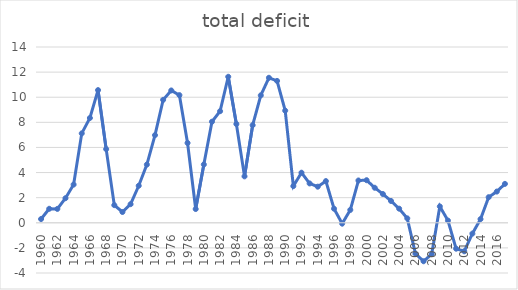
| Category | total deficit |
|---|---|
| 1960.0 | 0.298 |
| 1961.0 | 1.114 |
| 1962.0 | 1.105 |
| 1963.0 | 1.957 |
| 1964.0 | 3.044 |
| 1965.0 | 7.12 |
| 1966.0 | 8.345 |
| 1967.0 | 10.566 |
| 1968.0 | 5.867 |
| 1969.0 | 1.404 |
| 1970.0 | 0.858 |
| 1971.0 | 1.481 |
| 1972.0 | 2.948 |
| 1973.0 | 4.634 |
| 1974.0 | 6.981 |
| 1975.0 | 9.791 |
| 1976.0 | 10.538 |
| 1977.0 | 10.167 |
| 1978.0 | 6.357 |
| 1979.0 | 1.095 |
| 1980.0 | 4.641 |
| 1981.0 | 8.05 |
| 1982.0 | 8.889 |
| 1983.0 | 11.629 |
| 1984.0 | 7.867 |
| 1985.0 | 3.696 |
| 1986.0 | 7.776 |
| 1987.0 | 10.149 |
| 1988.0 | 11.549 |
| 1989.0 | 11.299 |
| 1990.0 | 8.929 |
| 1991.0 | 2.921 |
| 1992.0 | 3.989 |
| 1993.0 | 3.134 |
| 1994.0 | 2.875 |
| 1995.0 | 3.319 |
| 1996.0 | 1.121 |
| 1997.0 | -0.067 |
| 1998.0 | 1.025 |
| 1999.0 | 3.368 |
| 2000.0 | 3.39 |
| 2001.0 | 2.79 |
| 2002.0 | 2.292 |
| 2003.0 | 1.738 |
| 2004.0 | 1.123 |
| 2005.0 | 0.352 |
| 2006.0 | -2.454 |
| 2007.0 | -3.065 |
| 2008.0 | -2.501 |
| 2009.0 | 1.302 |
| 2010.0 | 0.176 |
| 2011.0 | -2.065 |
| 2012.0 | -2.271 |
| 2013.0 | -0.863 |
| 2014.0 | 0.291 |
| 2015.0 | 2.037 |
| 2016.0 | 2.486 |
| 2017.0 | 3.098 |